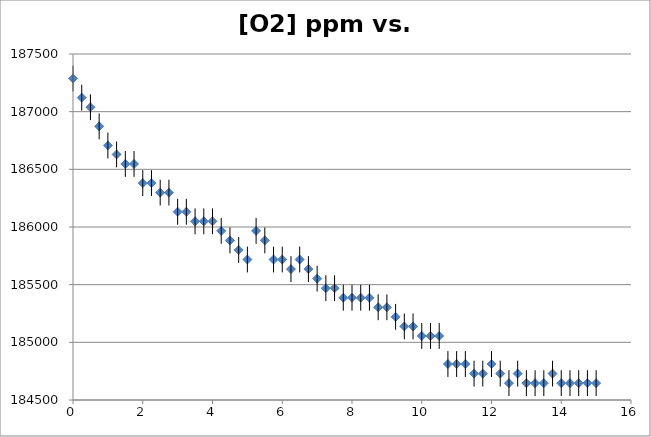
| Category | [O2] ppm |
|---|---|
| 0.0 | 187287.019 |
| 0.25 | 187121.314 |
| 0.5 | 187038.461 |
| 0.75 | 186872.755 |
| 1.0 | 186707.05 |
| 1.25 | 186629.375 |
| 1.5 | 186546.522 |
| 1.75 | 186546.522 |
| 2.0 | 186380.817 |
| 2.25 | 186380.817 |
| 2.5 | 186297.964 |
| 2.75 | 186297.964 |
| 3.0 | 186132.258 |
| 3.25 | 186132.258 |
| 3.5 | 186049.405 |
| 3.75 | 186049.405 |
| 4.0 | 186049.405 |
| 4.25 | 185966.553 |
| 4.5 | 185883.7 |
| 4.75 | 185800.847 |
| 5.0 | 185717.994 |
| 5.25 | 185966.553 |
| 5.5 | 185883.7 |
| 5.75 | 185717.994 |
| 6.0 | 185717.994 |
| 6.25 | 185635.141 |
| 6.5 | 185717.994 |
| 6.75 | 185635.141 |
| 7.0 | 185552.289 |
| 7.25 | 185469.436 |
| 7.5 | 185469.436 |
| 7.75 | 185386.583 |
| 8.0 | 185386.583 |
| 8.25 | 185386.583 |
| 8.5 | 185386.583 |
| 8.75 | 185303.73 |
| 9.0 | 185303.73 |
| 9.25 | 185220.877 |
| 9.5 | 185138.025 |
| 9.75 | 185138.025 |
| 10.0 | 185055.172 |
| 10.25 | 185055.172 |
| 10.5 | 185055.172 |
| 10.75 | 184811.792 |
| 11.0 | 184811.792 |
| 11.25 | 184811.792 |
| 11.5 | 184728.939 |
| 11.75 | 184728.939 |
| 12.0 | 184811.792 |
| 12.25 | 184728.939 |
| 12.5 | 184646.086 |
| 12.75 | 184728.939 |
| 13.0 | 184646.086 |
| 13.25 | 184646.086 |
| 13.5 | 184646.086 |
| 13.75 | 184728.939 |
| 14.0 | 184646.086 |
| 14.25 | 184646.086 |
| 14.5 | 184646.086 |
| 14.75 | 184646.086 |
| 15.0 | 184646.086 |